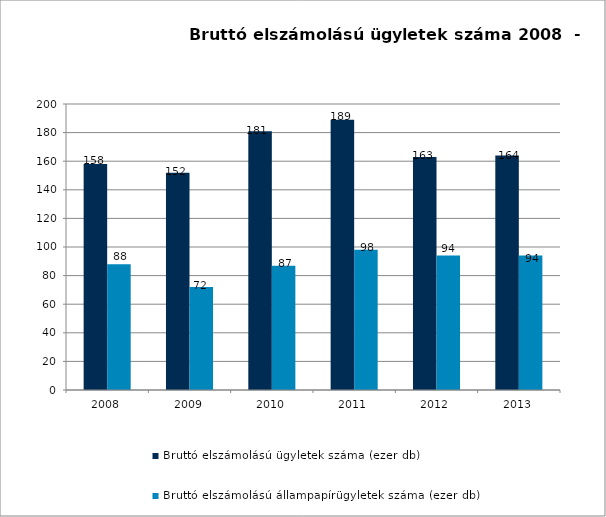
| Category | Bruttó elszámolású ügyletek száma (ezer db) | Bruttó elszámolású állampapírügyletek száma (ezer db) |
|---|---|---|
| 2008.0 | 158 | 88 |
| 2009.0 | 152 | 72 |
| 2010.0 | 180.925 | 86.815 |
| 2011.0 | 189 | 98 |
| 2012.0 | 163 | 94 |
| 2013.0 | 164 | 94 |